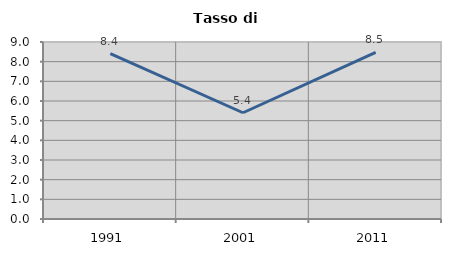
| Category | Tasso di disoccupazione   |
|---|---|
| 1991.0 | 8.414 |
| 2001.0 | 5.403 |
| 2011.0 | 8.475 |